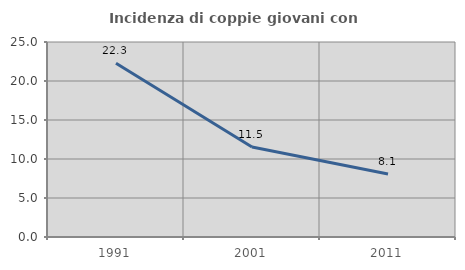
| Category | Incidenza di coppie giovani con figli |
|---|---|
| 1991.0 | 22.271 |
| 2001.0 | 11.538 |
| 2011.0 | 8.072 |